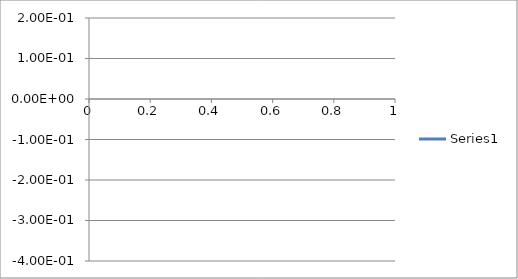
| Category | Series 0 |
|---|---|
| 0 | 0.01 |
| 1 | 0.01 |
| 2 | 0.01 |
| 3 | 0.01 |
| 4 | 0.01 |
| 5 | 0.01 |
| 6 | 0.01 |
| 7 | 0.01 |
| 8 | 0.009 |
| 9 | 0.01 |
| 10 | 0.01 |
| 11 | 0.009 |
| 12 | 0.009 |
| 13 | 0.009 |
| 14 | 0.009 |
| 15 | 0.009 |
| 16 | 0.009 |
| 17 | 0.009 |
| 18 | 0.009 |
| 19 | 0.009 |
| 20 | 0.009 |
| 21 | 0.009 |
| 22 | 0.009 |
| 23 | 0.009 |
| 24 | 0.009 |
| 25 | 0.009 |
| 26 | 0.009 |
| 27 | 0.009 |
| 28 | 0.009 |
| 29 | 0.01 |
| 30 | 0.009 |
| 31 | 0.009 |
| 32 | 0.011 |
| 33 | 0.013 |
| 34 | 0.01 |
| 35 | 0.002 |
| 36 | -0.008 |
| 37 | -0.023 |
| 38 | -0.054 |
| 39 | -0.099 |
| 40 | -0.134 |
| 41 | -0.124 |
| 42 | -0.062 |
| 43 | 0.019 |
| 44 | 0.067 |
| 45 | 0.061 |
| 46 | 0.014 |
| 47 | -0.043 |
| 48 | -0.09 |
| 49 | -0.119 |
| 50 | -0.127 |
| 51 | -0.115 |
| 52 | -0.088 |
| 53 | -0.052 |
| 54 | -0.011 |
| 55 | 0.033 |
| 56 | 0.079 |
| 57 | 0.12 |
| 58 | 0.149 |
| 59 | 0.16 |
| 60 | 0.156 |
| 61 | 0.144 |
| 62 | 0.133 |
| 63 | 0.125 |
| 64 | 0.117 |
| 65 | 0.104 |
| 66 | 0.084 |
| 67 | 0.061 |
| 68 | 0.037 |
| 69 | 0.013 |
| 70 | -0.011 |
| 71 | -0.035 |
| 72 | -0.059 |
| 73 | -0.08 |
| 74 | -0.098 |
| 75 | -0.113 |
| 76 | -0.127 |
| 77 | -0.145 |
| 78 | -0.165 |
| 79 | -0.188 |
| 80 | -0.211 |
| 81 | -0.232 |
| 82 | -0.251 |
| 83 | -0.266 |
| 84 | -0.276 |
| 85 | -0.281 |
| 86 | -0.279 |
| 87 | -0.272 |
| 88 | -0.261 |
| 89 | -0.246 |
| 90 | -0.23 |
| 91 | -0.214 |
| 92 | -0.199 |
| 93 | -0.186 |
| 94 | -0.177 |
| 95 | -0.173 |
| 96 | -0.174 |
| 97 | -0.177 |
| 98 | -0.18 |
| 99 | -0.181 |
| 100 | -0.181 |
| 101 | -0.177 |
| 102 | -0.171 |
| 103 | -0.162 |
| 104 | -0.153 |
| 105 | -0.144 |
| 106 | -0.137 |
| 107 | -0.133 |
| 108 | -0.13 |
| 109 | -0.13 |
| 110 | -0.129 |
| 111 | -0.129 |
| 112 | -0.129 |
| 113 | -0.128 |
| 114 | -0.128 |
| 115 | -0.127 |
| 116 | -0.127 |
| 117 | -0.126 |
| 118 | -0.125 |
| 119 | -0.125 |
| 120 | -0.124 |
| 121 | -0.123 |
| 122 | -0.122 |
| 123 | -0.121 |
| 124 | -0.12 |
| 125 | -0.119 |
| 126 | -0.117 |
| 127 | -0.113 |
| 128 | -0.109 |
| 129 | -0.104 |
| 130 | -0.098 |
| 131 | -0.093 |
| 132 | -0.089 |
| 133 | -0.085 |
| 134 | -0.082 |
| 135 | -0.08 |
| 136 | -0.079 |
| 137 | -0.079 |
| 138 | -0.079 |
| 139 | -0.08 |
| 140 | -0.081 |
| 141 | -0.082 |
| 142 | -0.082 |
| 143 | -0.082 |
| 144 | -0.082 |
| 145 | -0.082 |
| 146 | -0.082 |
| 147 | -0.081 |
| 148 | -0.081 |
| 149 | -0.081 |
| 150 | -0.08 |
| 151 | -0.079 |
| 152 | -0.078 |
| 153 | -0.076 |
| 154 | -0.074 |
| 155 | -0.071 |
| 156 | -0.068 |
| 157 | -0.065 |
| 158 | -0.062 |
| 159 | -0.06 |
| 160 | -0.058 |
| 161 | -0.056 |
| 162 | -0.055 |
| 163 | -0.055 |
| 164 | -0.055 |
| 165 | -0.055 |
| 166 | -0.055 |
| 167 | -0.055 |
| 168 | -0.055 |
| 169 | -0.055 |
| 170 | -0.055 |
| 171 | -0.056 |
| 172 | -0.057 |
| 173 | -0.058 |
| 174 | -0.06 |
| 175 | -0.062 |
| 176 | -0.064 |
| 177 | -0.066 |
| 178 | -0.068 |
| 179 | -0.069 |
| 180 | -0.07 |
| 181 | -0.069 |
| 182 | -0.067 |
| 183 | -0.065 |
| 184 | -0.062 |
| 185 | -0.059 |
| 186 | -0.056 |
| 187 | -0.053 |
| 188 | -0.05 |
| 189 | -0.047 |
| 190 | -0.044 |
| 191 | -0.041 |
| 192 | -0.039 |
| 193 | -0.037 |
| 194 | -0.036 |
| 195 | -0.036 |
| 196 | -0.036 |
| 197 | -0.037 |
| 198 | -0.037 |
| 199 | -0.038 |
| 200 | -0.039 |
| 201 | -0.041 |
| 202 | -0.042 |
| 203 | -0.044 |
| 204 | -0.045 |
| 205 | -0.047 |
| 206 | -0.048 |
| 207 | -0.049 |
| 208 | -0.05 |
| 209 | -0.05 |
| 210 | -0.05 |
| 211 | -0.05 |
| 212 | -0.05 |
| 213 | -0.05 |
| 214 | -0.049 |
| 215 | -0.049 |
| 216 | -0.049 |
| 217 | -0.048 |
| 218 | -0.047 |
| 219 | -0.047 |
| 220 | -0.046 |
| 221 | -0.045 |
| 222 | -0.044 |
| 223 | -0.043 |
| 224 | -0.042 |
| 225 | -0.041 |
| 226 | -0.04 |
| 227 | -0.039 |
| 228 | -0.038 |
| 229 | -0.038 |
| 230 | -0.038 |
| 231 | -0.038 |
| 232 | -0.039 |
| 233 | -0.039 |
| 234 | -0.04 |
| 235 | -0.04 |
| 236 | -0.04 |
| 237 | -0.039 |
| 238 | -0.039 |
| 239 | -0.038 |
| 240 | -0.038 |
| 241 | -0.037 |
| 242 | -0.036 |
| 243 | -0.035 |
| 244 | -0.034 |
| 245 | -0.033 |
| 246 | -0.032 |
| 247 | -0.03 |
| 248 | -0.029 |
| 249 | -0.029 |
| 250 | -0.028 |
| 251 | -0.028 |
| 252 | -0.028 |
| 253 | -0.029 |
| 254 | -0.029 |
| 255 | -0.029 |
| 256 | -0.03 |
| 257 | -0.03 |
| 258 | -0.031 |
| 259 | -0.032 |
| 260 | -0.032 |
| 261 | -0.033 |
| 262 | -0.034 |
| 263 | -0.034 |
| 264 | -0.034 |
| 265 | -0.034 |
| 266 | -0.034 |
| 267 | -0.034 |
| 268 | -0.033 |
| 269 | -0.032 |
| 270 | -0.032 |
| 271 | -0.031 |
| 272 | -0.029 |
| 273 | -0.028 |
| 274 | -0.027 |
| 275 | -0.026 |
| 276 | -0.025 |
| 277 | -0.025 |
| 278 | -0.024 |
| 279 | -0.023 |
| 280 | -0.022 |
| 281 | -0.022 |
| 282 | -0.021 |
| 283 | -0.021 |
| 284 | -0.021 |
| 285 | -0.021 |
| 286 | -0.021 |
| 287 | -0.022 |
| 288 | -0.023 |
| 289 | -0.024 |
| 290 | -0.024 |
| 291 | -0.025 |
| 292 | -0.025 |
| 293 | -0.026 |
| 294 | -0.026 |
| 295 | -0.027 |
| 296 | -0.027 |
| 297 | -0.027 |
| 298 | -0.028 |
| 299 | -0.027 |
| 300 | -0.027 |
| 301 | -0.027 |
| 302 | -0.026 |
| 303 | -0.025 |
| 304 | -0.025 |
| 305 | -0.024 |
| 306 | -0.023 |
| 307 | -0.023 |
| 308 | -0.023 |
| 309 | -0.022 |
| 310 | -0.022 |
| 311 | -0.022 |
| 312 | -0.022 |
| 313 | -0.022 |
| 314 | -0.022 |
| 315 | -0.022 |
| 316 | -0.022 |
| 317 | -0.023 |
| 318 | -0.024 |
| 319 | -0.025 |
| 320 | -0.026 |
| 321 | -0.026 |
| 322 | -0.027 |
| 323 | -0.028 |
| 324 | -0.028 |
| 325 | -0.028 |
| 326 | -0.028 |
| 327 | -0.028 |
| 328 | -0.028 |
| 329 | -0.028 |
| 330 | -0.027 |
| 331 | -0.027 |
| 332 | -0.026 |
| 333 | -0.026 |
| 334 | -0.025 |
| 335 | -0.024 |
| 336 | -0.023 |
| 337 | -0.023 |
| 338 | -0.022 |
| 339 | -0.022 |
| 340 | -0.021 |
| 341 | -0.021 |
| 342 | -0.021 |
| 343 | -0.021 |
| 344 | -0.021 |
| 345 | -0.02 |
| 346 | -0.02 |
| 347 | -0.02 |
| 348 | -0.02 |
| 349 | -0.02 |
| 350 | -0.02 |
| 351 | -0.02 |
| 352 | -0.021 |
| 353 | -0.021 |
| 354 | -0.021 |
| 355 | -0.021 |
| 356 | -0.021 |
| 357 | -0.021 |
| 358 | -0.02 |
| 359 | -0.02 |
| 360 | -0.02 |
| 361 | -0.02 |
| 362 | -0.021 |
| 363 | -0.021 |
| 364 | -0.021 |
| 365 | -0.021 |
| 366 | -0.02 |
| 367 | -0.02 |
| 368 | -0.02 |
| 369 | -0.02 |
| 370 | -0.019 |
| 371 | -0.019 |
| 372 | -0.019 |
| 373 | -0.019 |
| 374 | -0.019 |
| 375 | -0.019 |
| 376 | -0.02 |
| 377 | -0.02 |
| 378 | -0.019 |
| 379 | -0.019 |
| 380 | -0.019 |
| 381 | -0.019 |
| 382 | -0.018 |
| 383 | -0.018 |
| 384 | -0.018 |
| 385 | -0.017 |
| 386 | -0.017 |
| 387 | -0.016 |
| 388 | -0.016 |
| 389 | -0.016 |
| 390 | -0.015 |
| 391 | -0.014 |
| 392 | -0.014 |
| 393 | -0.014 |
| 394 | -0.013 |
| 395 | -0.013 |
| 396 | -0.013 |
| 397 | -0.013 |
| 398 | -0.013 |
| 399 | -0.013 |
| 400 | -0.013 |